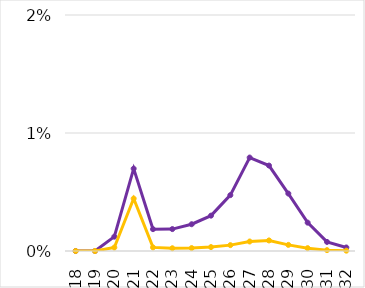
| Category | TE | Virus |
|---|---|---|
| 18.0 | 0 | 0 |
| 19.0 | 0 | 0 |
| 20.0 | 0.001 | 0 |
| 21.0 | 0.007 | 0.004 |
| 22.0 | 0.002 | 0 |
| 23.0 | 0.002 | 0 |
| 24.0 | 0.002 | 0 |
| 25.0 | 0.003 | 0 |
| 26.0 | 0.005 | 0 |
| 27.0 | 0.008 | 0.001 |
| 28.0 | 0.007 | 0.001 |
| 29.0 | 0.005 | 0.001 |
| 30.0 | 0.002 | 0 |
| 31.0 | 0.001 | 0 |
| 32.0 | 0 | 0 |